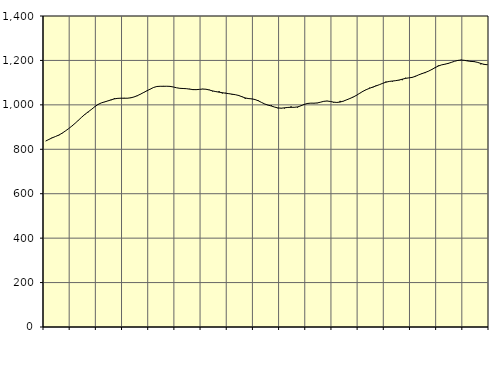
| Category | Piggar | Series 1 |
|---|---|---|
| nan | 837.2 | 837.03 |
| 87.0 | 844.1 | 844.34 |
| 87.0 | 853.3 | 851.46 |
| 87.0 | 857.9 | 857.43 |
| nan | 861.9 | 863.77 |
| 88.0 | 873.3 | 872.06 |
| 88.0 | 882.4 | 882.04 |
| 88.0 | 892.5 | 892.75 |
| nan | 903.9 | 904.34 |
| 89.0 | 916.7 | 916.91 |
| 89.0 | 929.1 | 930.48 |
| 89.0 | 943.9 | 944.34 |
| nan | 958.7 | 957.12 |
| 90.0 | 966.6 | 968.43 |
| 90.0 | 978.6 | 979.47 |
| 90.0 | 990.4 | 991.28 |
| nan | 1003.1 | 1001.68 |
| 91.0 | 1008.8 | 1008.76 |
| 91.0 | 1012.4 | 1013.27 |
| 91.0 | 1018.2 | 1017.52 |
| nan | 1020.9 | 1022.63 |
| 92.0 | 1030 | 1026.81 |
| 92.0 | 1027.6 | 1029.25 |
| 92.0 | 1031 | 1030.01 |
| nan | 1031.4 | 1029.8 |
| 93.0 | 1029.3 | 1030 |
| 93.0 | 1033.1 | 1031.62 |
| 93.0 | 1035.6 | 1035.51 |
| nan | 1039.4 | 1041.19 |
| 94.0 | 1047.6 | 1048.31 |
| 94.0 | 1057.3 | 1056.01 |
| 94.0 | 1062.6 | 1063.61 |
| nan | 1070.5 | 1071.22 |
| 95.0 | 1079.1 | 1078.28 |
| 95.0 | 1083.2 | 1082.67 |
| 95.0 | 1083.2 | 1083.63 |
| nan | 1085.1 | 1083.55 |
| 96.0 | 1083.4 | 1083.77 |
| 96.0 | 1084.2 | 1083.2 |
| 96.0 | 1080.7 | 1080.52 |
| nan | 1077.1 | 1076.98 |
| 97.0 | 1075.1 | 1074.45 |
| 97.0 | 1074.1 | 1073.63 |
| 97.0 | 1072.4 | 1072.83 |
| nan | 1072.2 | 1070.81 |
| 98.0 | 1066.6 | 1068.82 |
| 98.0 | 1070.2 | 1068.4 |
| 98.0 | 1070.2 | 1069.72 |
| nan | 1072 | 1071.07 |
| 99.0 | 1070 | 1070.34 |
| 99.0 | 1068.2 | 1067 |
| 99.0 | 1060.9 | 1062.84 |
| nan | 1058.3 | 1059.69 |
| 0.0 | 1061.8 | 1057.15 |
| 0.0 | 1051.2 | 1054.71 |
| 0.0 | 1054.1 | 1052.46 |
| nan | 1049.9 | 1050.35 |
| 1.0 | 1045.6 | 1048.03 |
| 1.0 | 1045.3 | 1045.64 |
| 1.0 | 1044.4 | 1042.15 |
| nan | 1038.1 | 1036.54 |
| 2.0 | 1027.2 | 1031.09 |
| 2.0 | 1030.1 | 1028.3 |
| 2.0 | 1025.9 | 1026.94 |
| nan | 1024.1 | 1023.96 |
| 3.0 | 1020.2 | 1018.31 |
| 3.0 | 1011.2 | 1010.81 |
| 3.0 | 1003.2 | 1003.78 |
| nan | 997.9 | 998.77 |
| 4.0 | 997.8 | 994.65 |
| 4.0 | 989.7 | 989.89 |
| 4.0 | 984.7 | 986.09 |
| nan | 984 | 985.1 |
| 5.0 | 983.9 | 986.59 |
| 5.0 | 986.8 | 988.45 |
| 5.0 | 993.2 | 988.95 |
| nan | 988 | 989.01 |
| 6.0 | 987.9 | 990.74 |
| 6.0 | 996.7 | 995.61 |
| 6.0 | 999.8 | 1001.92 |
| nan | 1008.3 | 1006.23 |
| 7.0 | 1007.3 | 1007.67 |
| 7.0 | 1006.7 | 1007.57 |
| 7.0 | 1007.7 | 1008.62 |
| nan | 1012.4 | 1011.95 |
| 8.0 | 1016.4 | 1015.82 |
| 8.0 | 1017.9 | 1017.26 |
| 8.0 | 1015 | 1015.27 |
| nan | 1010.2 | 1012.26 |
| 9.0 | 1011.4 | 1010.84 |
| 9.0 | 1017.8 | 1012.62 |
| 9.0 | 1016 | 1016.93 |
| nan | 1023.2 | 1022.62 |
| 10.0 | 1028.8 | 1028.62 |
| 10.0 | 1036.2 | 1035.05 |
| 10.0 | 1041.8 | 1043.05 |
| nan | 1053.3 | 1052.3 |
| 11.0 | 1060.8 | 1061.14 |
| 11.0 | 1066.8 | 1068.51 |
| 11.0 | 1077.2 | 1074.57 |
| nan | 1078 | 1080.22 |
| 12.0 | 1087.9 | 1085.42 |
| 12.0 | 1091.1 | 1090.8 |
| 12.0 | 1095.9 | 1096.85 |
| nan | 1104.8 | 1102.01 |
| 13.0 | 1105.4 | 1105.42 |
| 13.0 | 1105 | 1107.32 |
| 13.0 | 1108.5 | 1109 |
| nan | 1110.5 | 1111.63 |
| 14.0 | 1111 | 1115.52 |
| 14.0 | 1122 | 1119.23 |
| 14.0 | 1121.5 | 1121.41 |
| nan | 1122.1 | 1123.64 |
| 15.0 | 1130.4 | 1128.3 |
| 15.0 | 1135.2 | 1134.91 |
| 15.0 | 1142.4 | 1140.53 |
| nan | 1143 | 1145.7 |
| 16.0 | 1151.2 | 1151.61 |
| 16.0 | 1161.2 | 1159.05 |
| 16.0 | 1166.1 | 1167.31 |
| nan | 1177.4 | 1174.74 |
| 17.0 | 1180.1 | 1179.91 |
| 17.0 | 1182 | 1182.98 |
| 17.0 | 1184.4 | 1186.51 |
| nan | 1190.8 | 1191.19 |
| 18.0 | 1196.2 | 1196.29 |
| 18.0 | 1198.6 | 1200.15 |
| 18.0 | 1203.1 | 1201.59 |
| nan | 1201.4 | 1200.27 |
| 19.0 | 1200.1 | 1197.37 |
| 19.0 | 1193.4 | 1195.74 |
| 19.0 | 1197.1 | 1194.45 |
| nan | 1192.1 | 1191.3 |
| 20.0 | 1182.2 | 1186.45 |
| 20.0 | 1184.1 | 1182.16 |
| 20.0 | 1179.5 | 1180.66 |